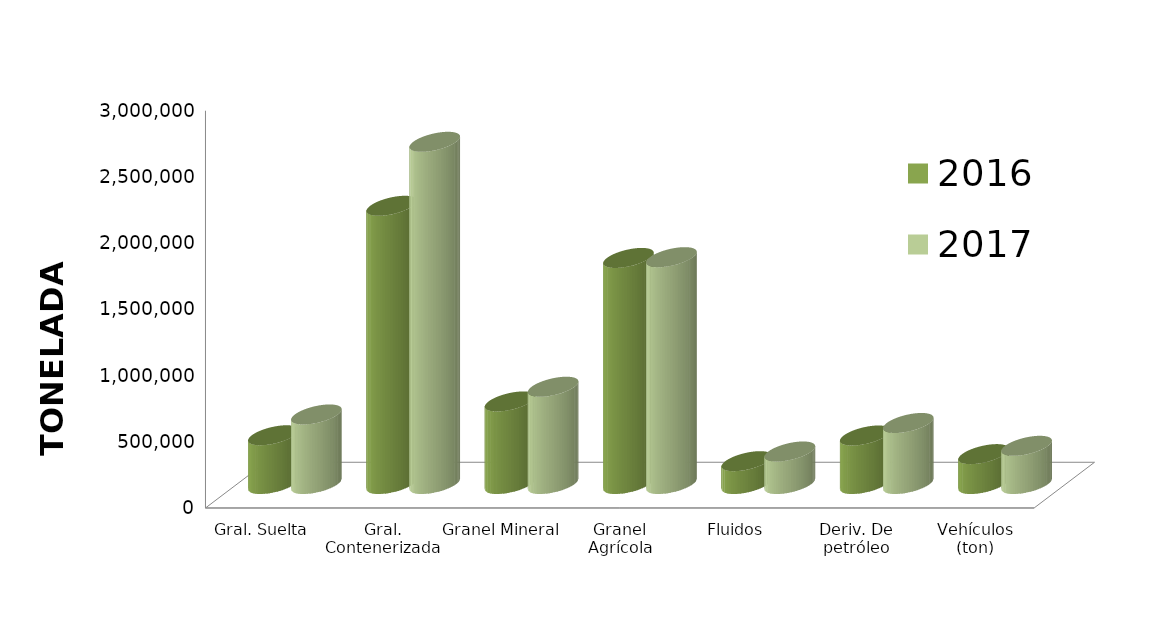
| Category | 2016 | 2017 |
|---|---|---|
| Gral. Suelta | 367947.357 | 525075.601 |
| Gral. Contenerizada | 2100850.93 | 2583998.682 |
| Granel Mineral | 623439.164 | 734445.07 |
| Granel Agrícola | 1707019.513 | 1712907.286 |
| Fluidos | 172289.178 | 245496.597 |
| Deriv. De petróleo | 366233.533 | 460704.395 |
| Vehículos (ton) | 225536.951 | 288304.517 |